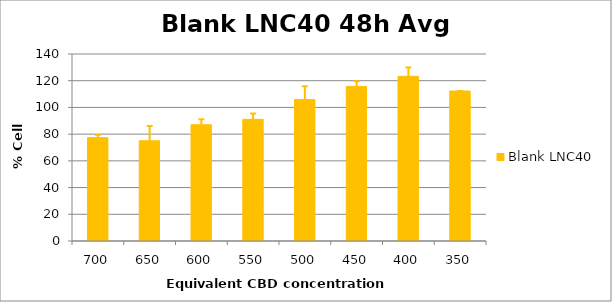
| Category | Blank LNC40 |
|---|---|
| 700.0 | 77.349 |
| 650.0 | 75.037 |
| 600.0 | 87.02 |
| 550.0 | 91.071 |
| 500.0 | 105.859 |
| 450.0 | 115.758 |
| 400.0 | 123.312 |
| 350.0 | 112.264 |